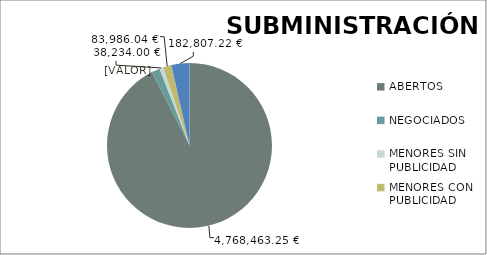
| Category | Series 0 |
|---|---|
| ABERTOS  | 4768463.25 |
| NEGOCIADOS  | 83673.86 |
| MENORES SIN PUBLICIDAD | 38234 |
| MENORES CON PUBLICIDAD | 83986.04 |
| PROCEDEMENTO SIMPLIFICADO | 182807.22 |